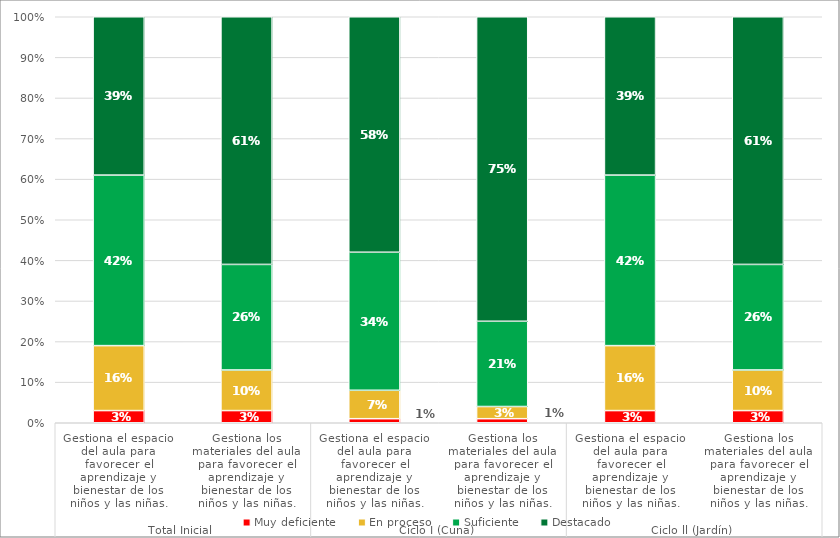
| Category | Muy deficiente | En proceso | Suficiente | Destacado |
|---|---|---|---|---|
| 0 | 0.03 | 0.16 | 0.42 | 0.39 |
| 1 | 0.03 | 0.1 | 0.26 | 0.61 |
| 2 | 0.01 | 0.07 | 0.34 | 0.58 |
| 3 | 0.01 | 0.03 | 0.21 | 0.75 |
| 4 | 0.03 | 0.16 | 0.42 | 0.39 |
| 5 | 0.03 | 0.1 | 0.26 | 0.61 |